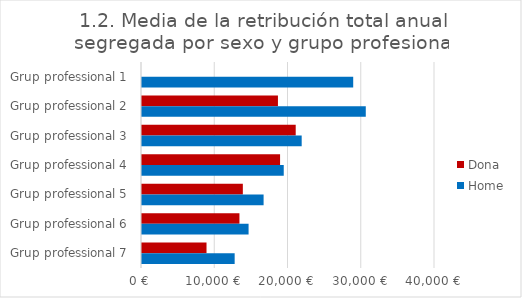
| Category | Dona | Home |
|---|---|---|
| Grup professional 1 | 0 | 28833.333 |
| Grup professional 2 | 18559 | 30550 |
| Grup professional 3 | 20984 | 21800 |
| Grup professional 4 | 18850 | 19350 |
| Grup professional 5 | 13766.667 | 16600 |
| Grup professional 6 | 13302.895 | 14550 |
| Grup professional 7 | 8808.5 | 12650 |